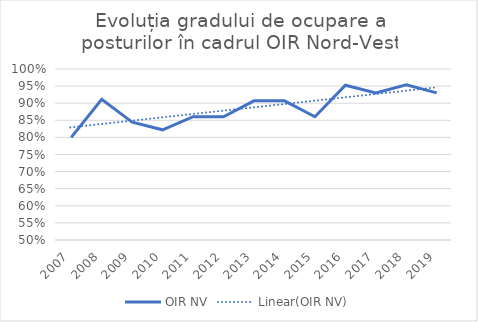
| Category | OIR NV |
|---|---|
| 2007.0 | 0.8 |
| 2008.0 | 0.911 |
| 2009.0 | 0.844 |
| 2010.0 | 0.822 |
| 2011.0 | 0.86 |
| 2012.0 | 0.86 |
| 2013.0 | 0.907 |
| 2014.0 | 0.907 |
| 2015.0 | 0.86 |
| 2016.0 | 0.952 |
| 2017.0 | 0.93 |
| 2018.0 | 0.954 |
| 2019.0 | 0.93 |